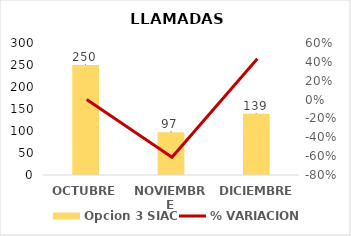
| Category | Opcion 3 SIAC |
|---|---|
| OCTUBRE | 250 |
| NOVIEMBRE | 97 |
| DICIEMBRE | 139 |